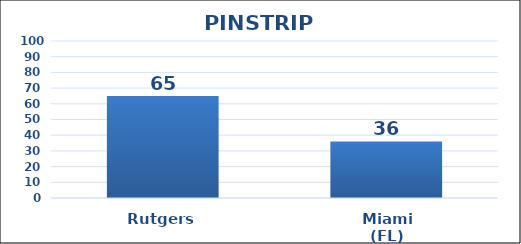
| Category | Series 0 |
|---|---|
| Rutgers | 65 |
| Miami (FL) | 36 |